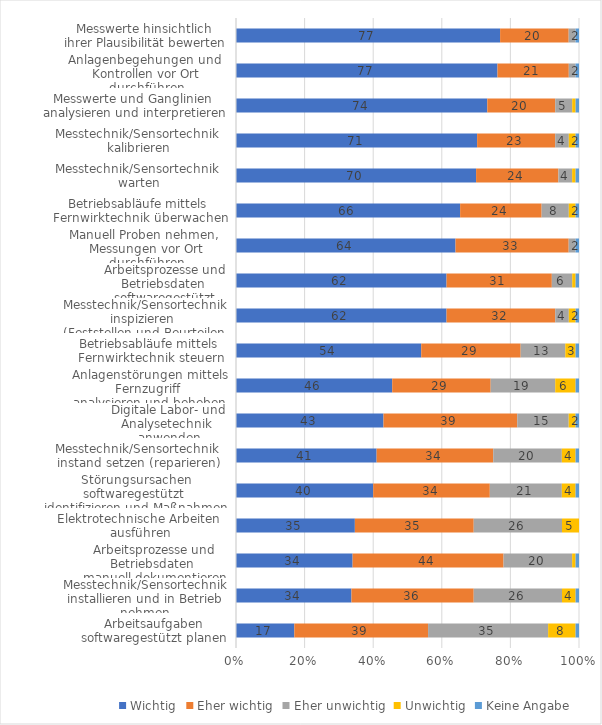
| Category | Wichtig | Eher wichtig | Eher unwichtig | Unwichtig | Keine Angabe |
|---|---|---|---|---|---|
| Arbeitsaufgaben softwaregestützt planen | 17 | 39 | 35 | 8 | 1 |
| Messtechnik/Sensortechnik installieren und in Betrieb nehmen | 34 | 36 | 26 | 4 | 1 |
| Arbeitsprozesse und Betriebsdaten 
manuell dokumentieren | 34 | 44 | 20 | 1 | 1 |
| Elektrotechnische Arbeiten 
ausführen | 35 | 35 | 26 | 5 | 0 |
| Störungsursachen softwaregestützt 
identifizieren und Maßnahmen einleiten | 40 | 34 | 21 | 4 | 1 |
| Messtechnik/Sensortechnik 
instand setzen (reparieren) | 41 | 34 | 20 | 4 | 1 |
| Digitale Labor- und Analysetechnik 
anwenden | 43 | 39 | 15 | 2 | 1 |
| Anlagenstörungen mittels Fernzugriff 
analysieren und beheben | 46 | 29 | 19 | 6 | 1 |
| Betriebsabläufe mittels 
Fernwirktechnik steuern | 54 | 29 | 13 | 3 | 1 |
| Messtechnik/Sensortechnik inspizieren 
(Feststellen und Beurteilen des Ist-Zustands) | 62 | 32 | 4 | 2 | 1 |
| Arbeitsprozesse und Betriebsdaten 
softwaregestützt dokumentieren | 62 | 31 | 6 | 1 | 1 |
| Manuell Proben nehmen, 
Messungen vor Ort durchführen | 64 | 33 | 2 | 0 | 1 |
| Betriebsabläufe mittels 
Fernwirktechnik überwachen | 66 | 24 | 8 | 2 | 1 |
| Messtechnik/Sensortechnik 
warten | 70 | 24 | 4 | 1 | 1 |
| Messtechnik/Sensortechnik 
kalibrieren | 71 | 23 | 4 | 2 | 1 |
| Messwerte und Ganglinien 
analysieren und interpretieren | 74 | 20 | 5 | 1 | 1 |
| Anlagenbegehungen und 
Kontrollen vor Ort durchführen | 77 | 21 | 2 | 0 | 1 |
| Messwerte hinsichtlich 
ihrer Plausibilität bewerten | 77 | 20 | 2 | 0 | 1 |